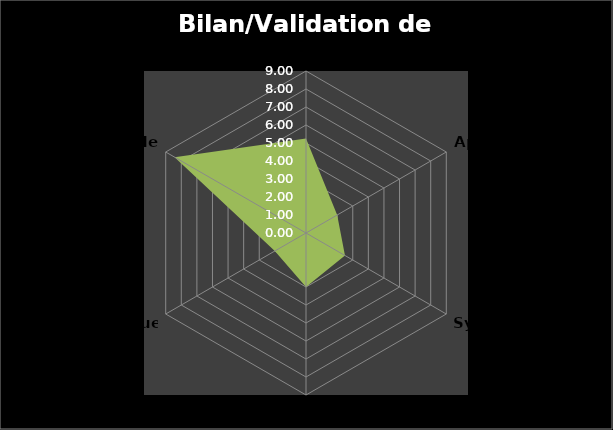
| Category | Bilan/Validation de compétences |
|---|---|
| Analyser | 5.25 |
| Appliquer | 2 |
| Synthétiser | 2.5 |
| Evaluer | 3 |
| Communiquer | 2 |
| Attitudes | 8.429 |